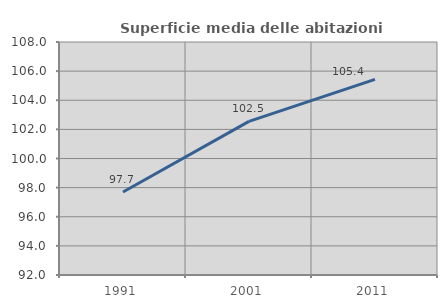
| Category | Superficie media delle abitazioni occupate |
|---|---|
| 1991.0 | 97.696 |
| 2001.0 | 102.545 |
| 2011.0 | 105.429 |